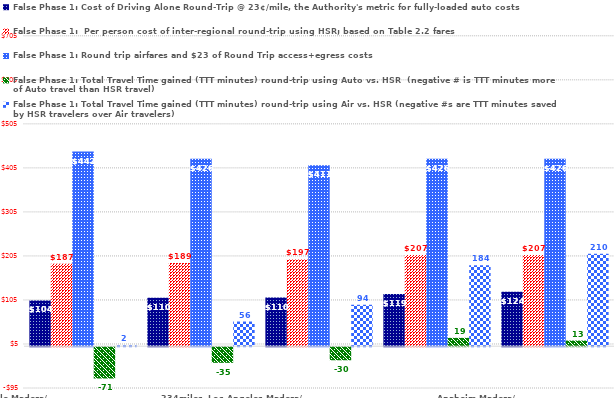
| Category | False Phase 1: Cost of Driving Alone Round-Trip @ 23¢/mile, the Authority's metric for fully-loaded auto costs | False Phase 1:  Per person cost of inter-regional round-trip using HSR; based on Table 2.2 fares | False Phase 1: Round trip airfares and $23 of Round Trip access+egress costs | False Phase 1: Total Travel Time gained (TTT minutes) round-trip using Auto vs. HSR  (negative # is TTT minutes more of Auto travel than HSR travel) | False Phase 1: Total Travel Time gained (TTT minutes) round-trip using Air vs. HSR (negative #s are TTT minutes saved by HSR travelers over Air travelers) |
|---|---|---|---|---|---|
| Palmdale-Madera/                                      234miles | 103.96 | 187 | 442 | -71.1 | 2 |
| Burbank (BUR)-Madera/                                         236miles | 109.94 | 189 | 426 | -35.5 | 56 |
| Los Angeles-Madera/                                               250miles | 110.4 | 197 | 411 | -29.7 | 94 |
| OC Gateway-Madera/                                                  263miles | 118.68 | 207 | 426 | 18.9 | 184 |
| Anaheim-Madera/                                                                277miles | 123.74 | 207 | 426 | 12.7 | 210 |